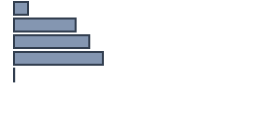
| Category | Percentatge |
|---|---|
| 0 | 5.833 |
| 1 | 25.682 |
| 2 | 31.364 |
| 3 | 37.045 |
| 4 | 0.076 |
| 5 | 0 |